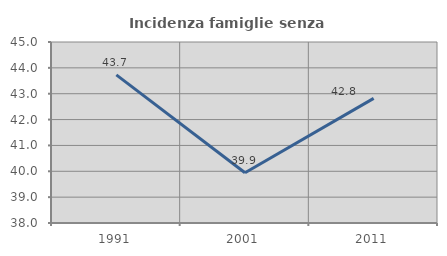
| Category | Incidenza famiglie senza nuclei |
|---|---|
| 1991.0 | 43.728 |
| 2001.0 | 39.943 |
| 2011.0 | 42.818 |